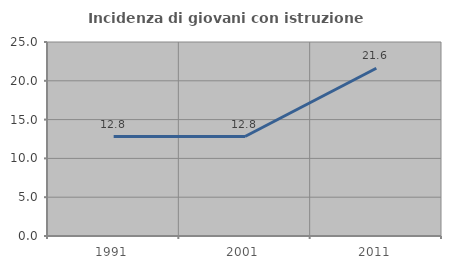
| Category | Incidenza di giovani con istruzione universitaria |
|---|---|
| 1991.0 | 12.821 |
| 2001.0 | 12.821 |
| 2011.0 | 21.622 |